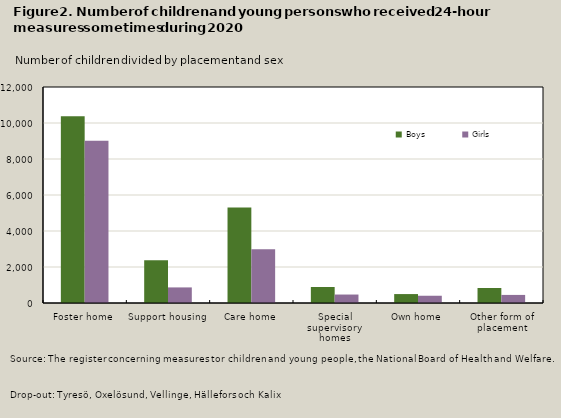
| Category | Boys | Girls |
|---|---|---|
| Foster home | 10370 | 9016 |
| Support housing | 2370 | 866 |
| Care home | 5306 | 2987 |
| Special supervisory homes | 888 | 470 |
| Own home | 496 | 403 |
| Other form of placement | 834 | 449 |